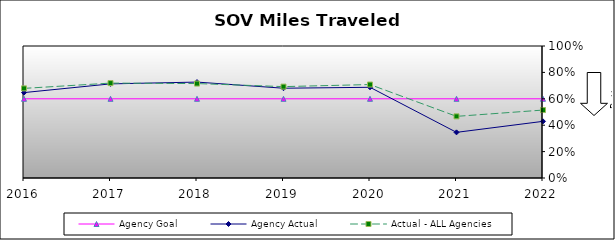
| Category | Agency Goal | Agency Actual | Actual - ALL Agencies |
|---|---|---|---|
| 2016.0 | 0.6 | 0.647 | 0.679 |
| 2017.0 | 0.6 | 0.713 | 0.719 |
| 2018.0 | 0.6 | 0.727 | 0.715 |
| 2019.0 | 0.6 | 0.68 | 0.692 |
| 2020.0 | 0.6 | 0.687 | 0.708 |
| 2021.0 | 0.6 | 0.346 | 0.467 |
| 2022.0 | 0.6 | 0.429 | 0.515 |